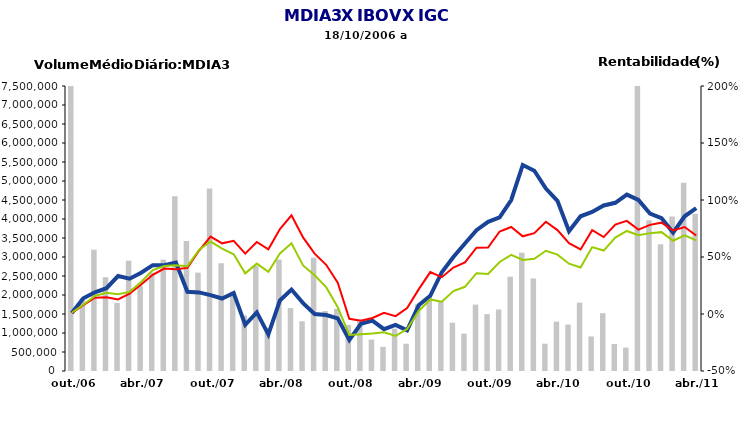
| Category | Volume |
|---|---|
| 2006-10-01 | 9245113.4 |
| 2006-11-01 | 1912622.316 |
| 2006-12-01 | 3192733.579 |
| 2007-01-01 | 2468470.381 |
| 2007-02-01 | 1790701.944 |
| 2007-03-01 | 2902917.682 |
| 2007-04-01 | 2235813.6 |
| 2007-05-01 | 2590560.5 |
| 2007-06-01 | 2930590.5 |
| 2007-07-01 | 4595414.905 |
| 2007-08-01 | 3420023.174 |
| 2007-09-01 | 2587945.947 |
| 2007-10-01 | 4804673.136 |
| 2007-11-01 | 2835118.316 |
| 2007-12-01 | 2082349.111 |
| 2008-01-01 | 1463108.714 |
| 2008-02-01 | 2767606.579 |
| 2008-03-01 | 1137647.95 |
| 2008-04-01 | 2930644.286 |
| 2008-05-01 | 1655368.6 |
| 2008-06-01 | 1308743 |
| 2008-07-01 | 2982138.091 |
| 2008-08-01 | 1577209.095 |
| 2008-09-01 | 1633666.955 |
| 2008-10-01 | 1213775.913 |
| 2008-11-01 | 1359388.316 |
| 2008-12-01 | 827108.55 |
| 2009-01-02 | 634991.381 |
| 2009-02-03 | 1112689.556 |
| 2009-03-04 | 718257.5 |
| 2009-04-05 | 1751342.8 |
| 2009-05-06 | 1940939.65 |
| 2009-06-07 | 1836070.81 |
| 2009-07-08 | 1271350.955 |
| 2009-08-09 | 981380.857 |
| 2009-09-10 | 1747613.476 |
| 2009-10-11 | 1496824.238 |
| 2009-11-01 | 1620166.316 |
| 2009-12-01 | 2482156.6 |
| 2010-01-02 | 3112507.737 |
| 2010-02-01 | 2434139.111 |
| 2010-03-01 | 718257.5 |
| 2010-04-01 | 1299562.15 |
| 2010-05-02 | 1220178.381 |
| 2010-06-03 | 1799636.19 |
| 2010-07-01 | 908938.381 |
| 2010-08-01 | 1521864.091 |
| 2010-09-01 | 711478.143 |
| 2010-10-01 | 615868.95 |
| 2010-11-01 | 23241437.5 |
| 2010-12-01 | 3967615.667 |
| 2011-01-01 | 3335406.9 |
| 2011-02-02 | 4064752.95 |
| 2011-03-06 | 4952332.095 |
| 2011-04-07 | 4136989.333 |